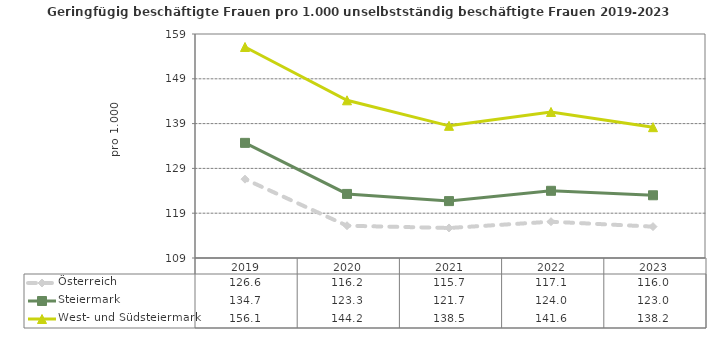
| Category | Österreich | Steiermark | West- und Südsteiermark |
|---|---|---|---|
| 2023.0 | 116 | 123 | 138.2 |
| 2022.0 | 117.1 | 124 | 141.6 |
| 2021.0 | 115.7 | 121.7 | 138.5 |
| 2020.0 | 116.2 | 123.3 | 144.2 |
| 2019.0 | 126.6 | 134.7 | 156.1 |